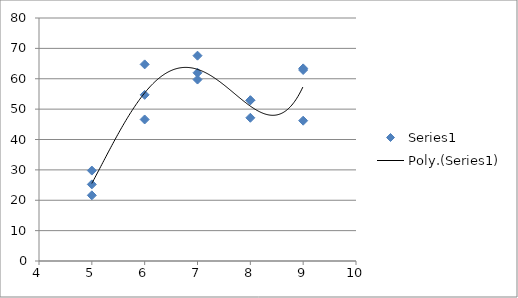
| Category | Series 0 |
|---|---|
| 5.0 | 25.218 |
| 5.0 | 29.771 |
| 5.0 | 21.619 |
| 6.0 | 64.729 |
| 6.0 | 46.593 |
| 6.0 | 54.703 |
| 7.0 | 61.97 |
| 7.0 | 59.737 |
| 7.0 | 67.593 |
| 8.0 | 52.937 |
| 8.0 | 52.874 |
| 8.0 | 47.155 |
| 9.0 | 63.411 |
| 9.0 | 46.194 |
| 9.0 | 62.881 |